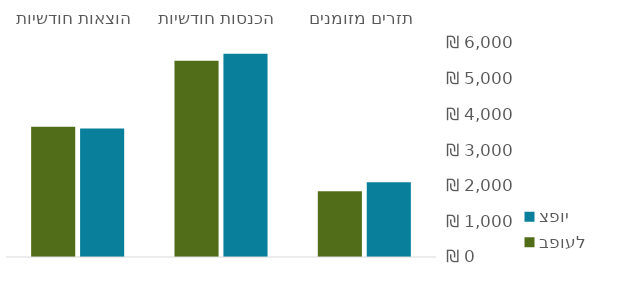
| Category | צפוי | בפועל |
|---|---|---|
| תזרים מזומנים | 2097 | 1845 |
| הכנסות חודשיות | 5700 | 5500 |
| הוצאות חודשיות | 3603 | 3655 |